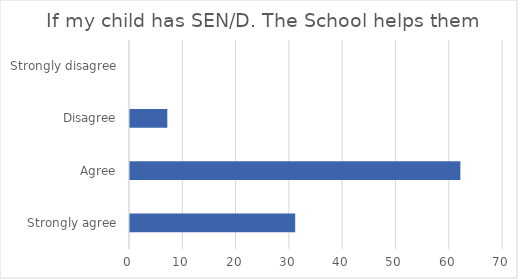
| Category | Series 1 |
|---|---|
| Strongly agree | 31 |
| Agree | 62 |
| Disagree | 7 |
| Strongly disagree | 0 |